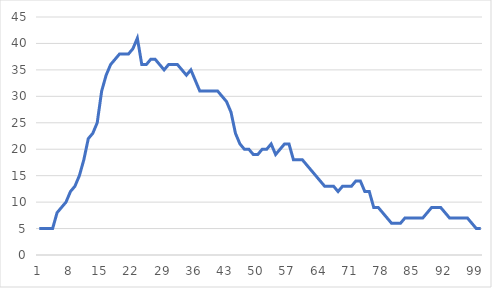
| Category | Observations |
|---|---|
| 0 | 5 |
| 1 | 5 |
| 2 | 5 |
| 3 | 5 |
| 4 | 8 |
| 5 | 9 |
| 6 | 10 |
| 7 | 12 |
| 8 | 13 |
| 9 | 15 |
| 10 | 18 |
| 11 | 22 |
| 12 | 23 |
| 13 | 25 |
| 14 | 31 |
| 15 | 34 |
| 16 | 36 |
| 17 | 37 |
| 18 | 38 |
| 19 | 38 |
| 20 | 38 |
| 21 | 39 |
| 22 | 41 |
| 23 | 36 |
| 24 | 36 |
| 25 | 37 |
| 26 | 37 |
| 27 | 36 |
| 28 | 35 |
| 29 | 36 |
| 30 | 36 |
| 31 | 36 |
| 32 | 35 |
| 33 | 34 |
| 34 | 35 |
| 35 | 33 |
| 36 | 31 |
| 37 | 31 |
| 38 | 31 |
| 39 | 31 |
| 40 | 31 |
| 41 | 30 |
| 42 | 29 |
| 43 | 27 |
| 44 | 23 |
| 45 | 21 |
| 46 | 20 |
| 47 | 20 |
| 48 | 19 |
| 49 | 19 |
| 50 | 20 |
| 51 | 20 |
| 52 | 21 |
| 53 | 19 |
| 54 | 20 |
| 55 | 21 |
| 56 | 21 |
| 57 | 18 |
| 58 | 18 |
| 59 | 18 |
| 60 | 17 |
| 61 | 16 |
| 62 | 15 |
| 63 | 14 |
| 64 | 13 |
| 65 | 13 |
| 66 | 13 |
| 67 | 12 |
| 68 | 13 |
| 69 | 13 |
| 70 | 13 |
| 71 | 14 |
| 72 | 14 |
| 73 | 12 |
| 74 | 12 |
| 75 | 9 |
| 76 | 9 |
| 77 | 8 |
| 78 | 7 |
| 79 | 6 |
| 80 | 6 |
| 81 | 6 |
| 82 | 7 |
| 83 | 7 |
| 84 | 7 |
| 85 | 7 |
| 86 | 7 |
| 87 | 8 |
| 88 | 9 |
| 89 | 9 |
| 90 | 9 |
| 91 | 8 |
| 92 | 7 |
| 93 | 7 |
| 94 | 7 |
| 95 | 7 |
| 96 | 7 |
| 97 | 6 |
| 98 | 5 |
| 99 | 5 |